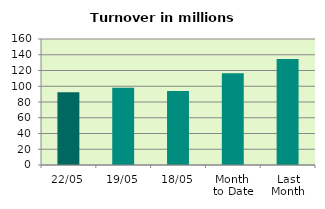
| Category | Series 0 |
|---|---|
| 22/05 | 92.489 |
| 19/05 | 97.949 |
| 18/05 | 94.008 |
| Month 
to Date | 116.393 |
| Last
Month | 134.694 |